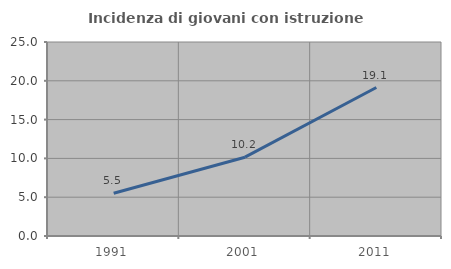
| Category | Incidenza di giovani con istruzione universitaria |
|---|---|
| 1991.0 | 5.505 |
| 2001.0 | 10.156 |
| 2011.0 | 19.13 |